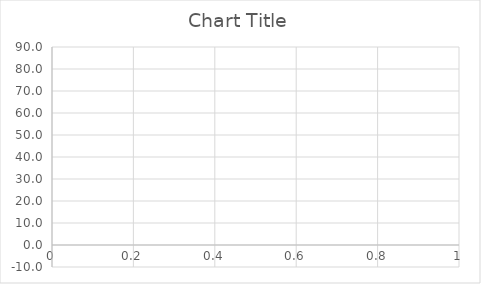
| Category | Series 0 |
|---|---|
| 0 | -2.122 |
| 1 | -3.214 |
| 2 | -2.446 |
| 3 | -1.488 |
| 4 | 1.091 |
| 5 | 0.769 |
| 6 | 0.427 |
| 7 | -0.821 |
| 8 | -2.725 |
| 9 | 0.324 |
| 10 | 22.42 |
| 11 | 58.616 |
| 12 | 76.245 |
| 13 | 78.618 |
| 14 | 77.183 |
| 15 | 72.966 |
| 16 | 70.523 |
| 17 | 62.672 |
| 18 | 58.032 |
| 19 | 60.592 |
| 20 | 58.274 |
| 21 | 51.979 |
| 22 | 46.873 |
| 23 | 41.52 |
| 24 | 32.618 |
| 25 | 31.074 |
| 26 | 25.636 |
| 27 | 20.217 |
| 28 | 17.906 |
| 29 | 12.633 |
| 30 | 11.959 |
| 31 | 9.368 |
| 32 | 5.141 |
| 33 | 2.675 |
| 34 | 1.587 |
| 35 | 1.936 |
| 36 | 1.62 |
| 37 | 0.315 |
| 38 | 1.074 |
| 39 | 1.838 |
| 40 | 0.278 |
| 41 | -1.41 |
| 42 | -0.138 |
| 43 | -1.737 |
| 44 | -0.423 |
| 45 | -3.464 |